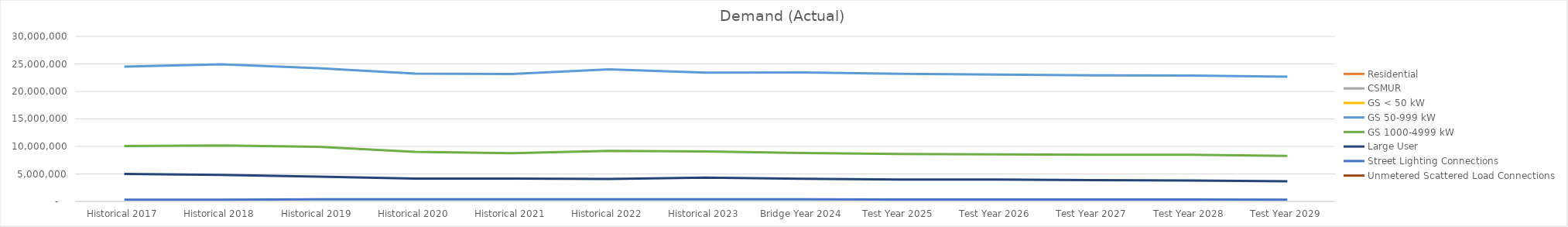
| Category | Residential | CSMUR | GS < 50 kW | GS 50-999 kW | GS 1000-4999 kW | Large User | Street Lighting Connections | Unmetered Scattered Load Connections |
|---|---|---|---|---|---|---|---|---|
| Historical 2017 |  |  |  | 24491102.345 | 10072182.441 | 4994367.551 | 325116.216 |  |
| Historical 2018 |  |  |  | 24928946.079 | 10190742.051 | 4806458.495 | 326193.686 |  |
| Historical 2019 |  |  |  | 24237414.802 | 9916370.564 | 4520863.183 | 374967.734 |  |
| Historical 2020 |  |  |  | 23233958.248 | 9018552.463 | 4158577.012 | 387653.976 |  |
| Historical 2021 |  |  |  | 23184662.403 | 8783997.722 | 4145399.434 | 394838.479 |  |
| Historical 2022 |  |  |  | 24017508.019 | 9205271.91 | 4101923.468 | 389418.611 |  |
| Historical 2023 |  |  |  | 23411930.856 | 9099817.677 | 4321408.357 | 383743.69 |  |
| Bridge Year 2024 |  |  |  | 23450565.539 | 8793611.528 | 4117090.096 | 374579.822 |  |
| Test Year 2025 |  |  |  | 23208058.508 | 8630976.227 | 3965274.526 | 363522.15 |  |
| Test Year 2026 |  |  |  | 23066939.022 | 8557350.766 | 3970922.867 | 354445.847 |  |
| Test Year 2027 |  |  |  | 22936011.032 | 8490997.553 | 3875599.768 | 345448.491 |  |
| Test Year 2028 |  |  |  | 22876540.114 | 8473655.885 | 3802516.239 | 336528.493 |  |
| Test Year 2029 |  |  |  | 22687107.934 | 8277467.085 | 3671843.192 | 327684.311 |  |